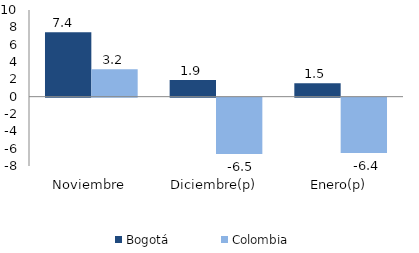
| Category | Bogotá | Colombia |
|---|---|---|
| Noviembre | 7.425 | 3.16 |
| Diciembre(p) | 1.916 | -6.503 |
| Enero(p) | 1.539 | -6.372 |